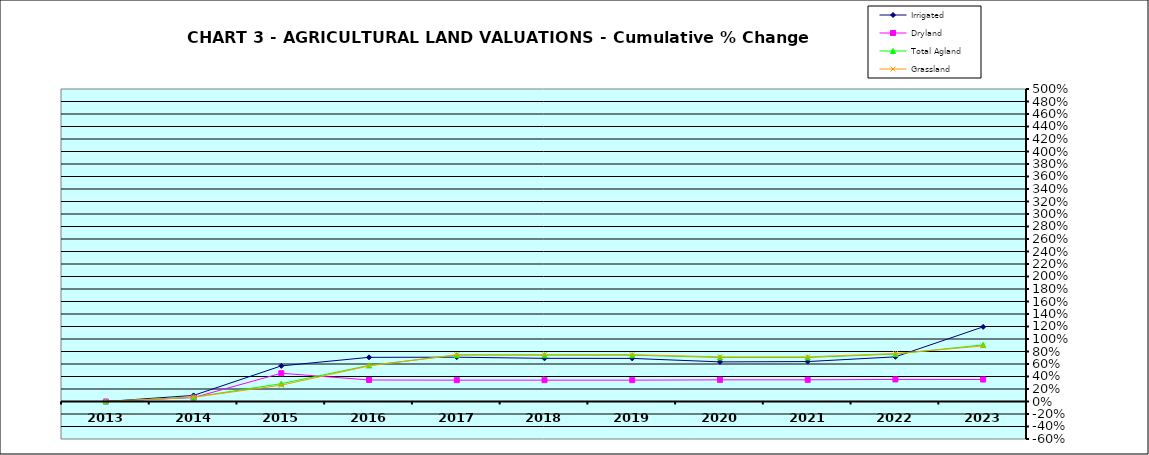
| Category | Irrigated | Dryland | Total Agland | Grassland |
|---|---|---|---|---|
| 2013.0 | 0 | 0 | 0 | 0 |
| 2014.0 | 0.097 | 0.063 | 0.07 | 0.068 |
| 2015.0 | 0.57 | 0.452 | 0.285 | 0.261 |
| 2016.0 | 0.707 | 0.344 | 0.578 | 0.57 |
| 2017.0 | 0.709 | 0.341 | 0.742 | 0.749 |
| 2018.0 | 0.691 | 0.341 | 0.741 | 0.75 |
| 2019.0 | 0.689 | 0.341 | 0.741 | 0.75 |
| 2020.0 | 0.634 | 0.347 | 0.705 | 0.714 |
| 2021.0 | 0.639 | 0.347 | 0.705 | 0.714 |
| 2022.0 | 0.715 | 0.353 | 0.759 | 0.767 |
| 2023.0 | 1.194 | 0.351 | 0.906 | 0.889 |